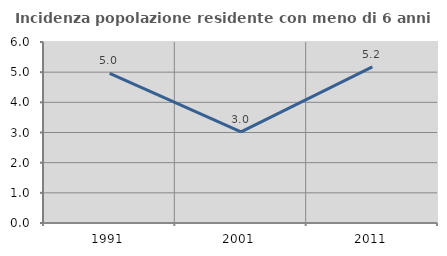
| Category | Incidenza popolazione residente con meno di 6 anni |
|---|---|
| 1991.0 | 4.959 |
| 2001.0 | 3.023 |
| 2011.0 | 5.172 |